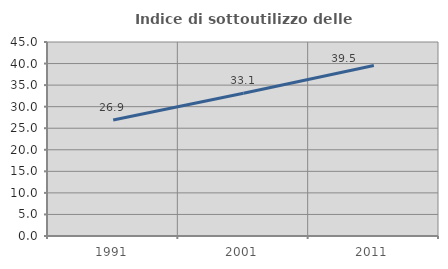
| Category | Indice di sottoutilizzo delle abitazioni  |
|---|---|
| 1991.0 | 26.901 |
| 2001.0 | 33.094 |
| 2011.0 | 39.537 |